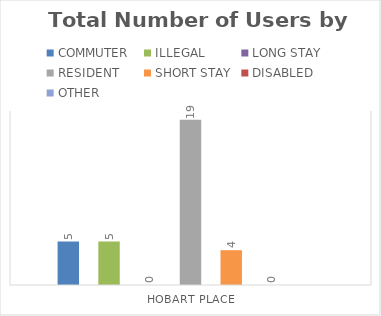
| Category | COMMUTER | ILLEGAL | LONG STAY | RESIDENT | SHORT STAY | DISABLED | OTHER |
|---|---|---|---|---|---|---|---|
| HOBART PLACE | 5 | 5 | 0 | 19 | 4 | 0 | 0 |